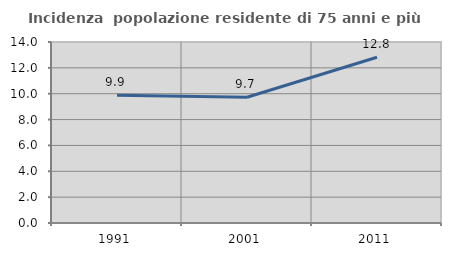
| Category | Incidenza  popolazione residente di 75 anni e più |
|---|---|
| 1991.0 | 9.873 |
| 2001.0 | 9.73 |
| 2011.0 | 12.821 |